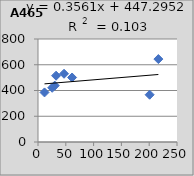
| Category | A465 |
|---|---|
| 25.5 | 421 |
| 61.3 | 501 |
| 11.7 | 385 |
| 216.5 | 644 |
| 46.8 | 530 |
| 32.5 | 515 |
| 200.8 | 367 |
| 30.1 | 438 |